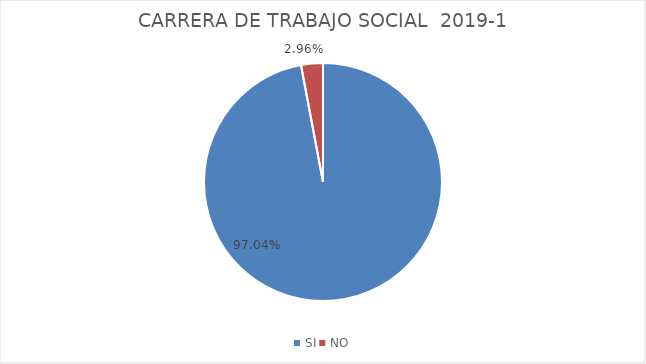
| Category | Series 0 |
|---|---|
| SI | 0.97 |
| NO | 0.03 |